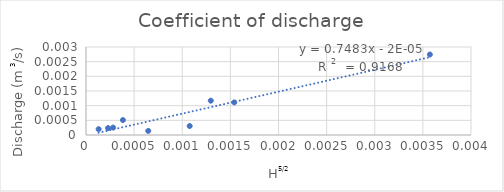
| Category | QA (m3/s) |
|---|---|
| 0.0002291765149399039 | 0 |
| 0.00028148742067808294 | 0 |
| 0.00013118829216054312 | 0 |
| 0.0012964181424216497 | 0.001 |
| 0.001077167872246475 | 0 |
| 0.003572508309997331 | 0.003 |
| 0.0006466803638583744 | 0 |
| 0.0015404696929832793 | 0.001 |
| 0.00038341680062302933 | 0.001 |